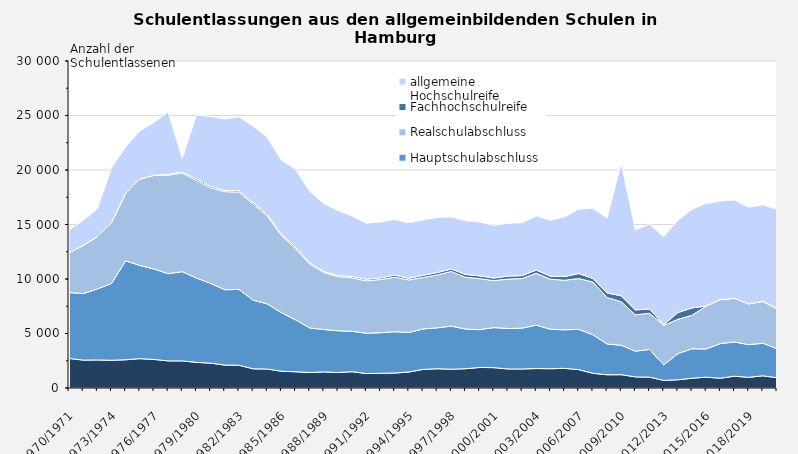
| Category | Ohne Abschluss | Hauptschulabschluss | Realschulabschluss | Fachhochschulreife | allgemeine Hochschulreife |
|---|---|---|---|---|---|
| 1970/1971 | 2715 | 6046 | 3646 | 0 | 2101 |
| 1971/1972 | 2559 | 6100 | 4406 | 0 | 2304 |
| 1972/1973 | 2572 | 6513 | 4805 | 0 | 2548 |
| 1973/1974 | 2541 | 7047 | 5581 | 0 | 5021 |
| 1974/1975 | 2590 | 9077 | 6184 | 0 | 4288 |
| 1975/1976 | 2693 | 8551 | 7928 | 0 | 4409 |
| 1976/1977 | 2619 | 8298 | 8594 | 3 | 4852 |
| 1977/1978 | 2488 | 7998 | 9034 | 101 | 5716 |
| 1978/1979 | 2486 | 8187 | 9053 | 87 | 1263 |
| 1979/1980 | 2352 | 7736 | 8937 | 149 | 5870 |
| 1980/1981 | 2281 | 7316 | 8751 | 148 | 6421 |
| 1981/1982 | 2105 | 6911 | 9002 | 111 | 6549 |
| 1982/1983 | 2091 | 6953 | 8923 | 129 | 6782 |
| 1983/1984 | 1761 | 6302 | 8816 | 137 | 7016 |
| 1984/1985 | 1743 | 5974 | 8067 | 144 | 7069 |
| 1985/1986 | 1537 | 5373 | 7072 | 128 | 6786 |
| 1986/1987 | 1490 | 4764 | 6514 | 132 | 7155 |
| 1987/1988 | 1420 | 4092 | 5855 | 122 | 6557 |
| 1988/1989 | 1479 | 3885 | 5224 | 103 | 6246 |
| 1989/1990 | 1417 | 3835 | 4969 | 99 | 5961 |
| 1990/1991 | 1497 | 3708 | 4902 | 126 | 5536 |
| 1991/1992 | 1326 | 3699 | 4806 | 143 | 5152 |
| 1992/1993 | 1353 | 3718 | 4881 | 151 | 5130 |
| 1993/1994 | 1371 | 3795 | 4997 | 197 | 5106 |
| 1994/1995 | 1467 | 3627 | 4818 | 146 | 5104 |
| 1995/1996 | 1705 | 3716 | 4716 | 202 | 5083 |
| 1996/1997 | 1767 | 3752 | 4852 | 216 | 5068 |
| 1997/1998 | 1725 | 3954 | 5017 | 226 | 4780 |
| 1998/1999 | 1767 | 3642 | 4746 | 263 | 4933 |
| 1999/2000 | 1884 | 3472 | 4677 | 256 | 4939 |
| 2000/2001 | 1867 | 3676 | 4309 | 235 | 4846 |
| 2001/2002 | 1747 | 3713 | 4530 | 277 | 4840 |
| 2002/2003 | 1747 | 3747 | 4548 | 268 | 4856 |
| 2003/2004 | 1785 | 3983 | 4761 | 291 | 4965 |
| 2004/2005 | 1771 | 3616 | 4597 | 272 | 5132 |
| 2005/2006 | 1802 | 3541 | 4539 | 343 | 5465 |
| 2006/2007 | 1684 | 3695 | 4663 | 460 | 5912 |
| 2007/2008 | 1349 | 3536 | 4841 | 325 | 6445 |
| 2008/2009 | 1213 | 2822 | 4269 | 420 | 6879 |
| 2009/2010 | 1224 | 2698 | 3993 | 542 | 12176 |
| 2010/2011 | 1020 | 2359 | 3330 | 460 | 7345 |
| 2011/2012 | 993 | 2546 | 3317 | 395 | 7783 |
| 2012/2013 | 697 | 1425 | 3625 | 61 | 8066 |
| 2013/2014 | 755 | 2396 | 3149 | 620 | 8459 |
| 2014/2015 | 897 | 2703 | 3073 | 677 | 9036 |
| 2015/2016 | 992 | 2588 | 3944 | 0 | 9420 |
| 2016/2017 | 896 | 3178 | 4034 | 0 | 9038 |
| 2017/2018 | 1084 | 3138 | 4001 | 0 | 9032 |
| 2018/2019 | 978 | 3000 | 3742 | 0 | 8855 |
| 2019/2020 | 1119 | 2986 | 3846 | 0 | 8860 |
| 2020/2021 | 945 | 2667 | 3669 | 0 | 9101 |